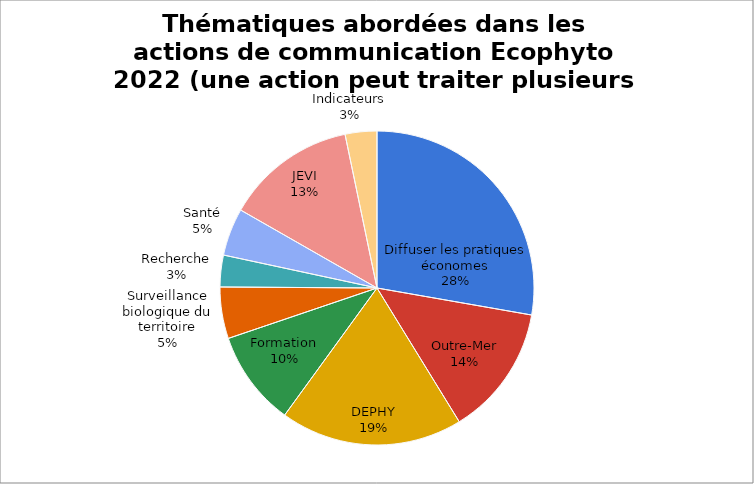
| Category | Thématiques abordées dans les actions de communication Ecophyto 2022 (une action peut traiter plusieurs thématiques) |
|---|---|
| Diffuser les pratiques économes | 68 |
| Outre-Mer | 33 |
| DEPHY | 46 |
| Formation | 24 |
| Surveillance biologique du territoire | 13 |
| Recherche | 8 |
| Santé | 12 |
| JEVI | 33 |
| Indicateurs | 8 |